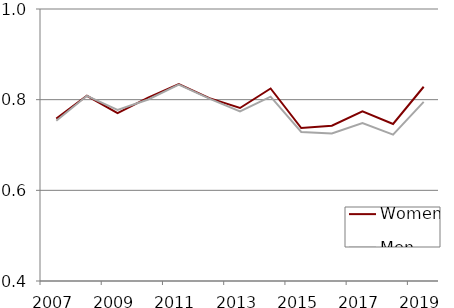
| Category | Women | Men |
|---|---|---|
| 2007.0 | 0.758 | 0.754 |
| 2008.0 | 0.809 | 0.808 |
| 2009.0 | 0.77 | 0.777 |
| 2010.0 | 0.805 | 0.8 |
| 2011.0 | 0.835 | 0.833 |
| 2012.0 | 0.804 | 0.802 |
| 2013.0 | 0.782 | 0.774 |
| 2014.0 | 0.825 | 0.807 |
| 2015.0 | 0.737 | 0.729 |
| 2016.0 | 0.743 | 0.725 |
| 2017.0 | 0.774 | 0.749 |
| 2018.0 | 0.746 | 0.723 |
| 2019.0 | 0.829 | 0.795 |